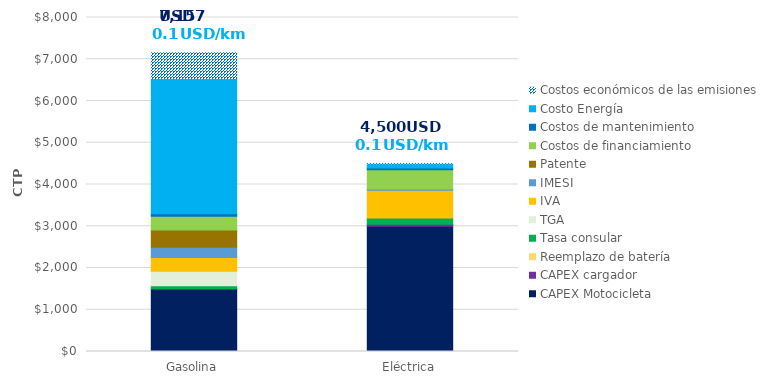
| Category | CAPEX Motocicleta | CAPEX cargador | Reemplazo de batería | Tasa consular | TGA | IVA | IMESI | Patente | Costos de financiamiento | Costos de mantenimiento | Costo Energía | Costos económicos de las emisiones |
|---|---|---|---|---|---|---|---|---|---|---|---|---|
| Gasolina | 1500 | 0 | 0 | 75 | 345 | 330 | 246.75 | 412.5 | 331.386 | 60 | 3239.323 | 616.8 |
| Eléctrica | 3000 | 50 | 0 | 150 | 0 | 660 | 34.5 | 0 | 458.326 | 42 | 103.427 | 1.476 |